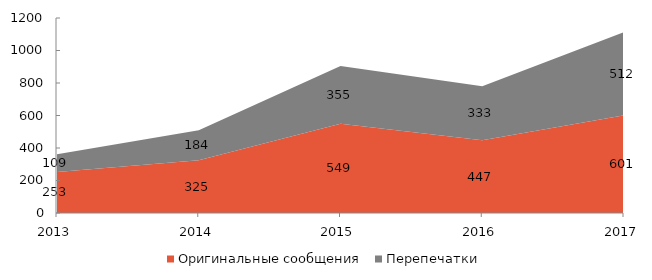
| Category | Оригинальные сообщения | Перепечатки |
|---|---|---|
| 2013 | 253 | 109 |
| 2014 | 325 | 184 |
| 2015 | 549 | 355 |
| 2016 | 447 | 333 |
| 2017 | 601 | 512 |